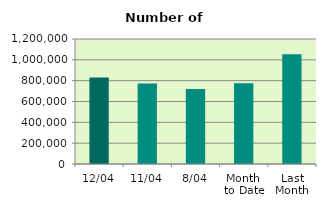
| Category | Series 0 |
|---|---|
| 12/04 | 830102 |
| 11/04 | 772504 |
| 8/04 | 719208 |
| Month 
to Date | 775013.5 |
| Last
Month | 1053589.478 |